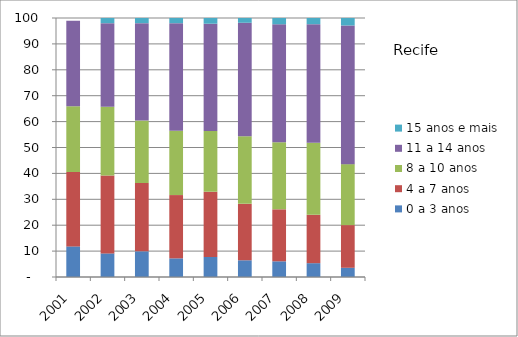
| Category | 0 a 3 anos | 4 a 7 anos | 8 a 10 anos | 11 a 14 anos | 15 anos e mais |
|---|---|---|---|---|---|
| 2001.0 | 11.82 | 28.71 | 25.37 | 32.99 | 0 |
| 2002.0 | 9.12 | 30.08 | 26.5 | 32.3 | 2 |
| 2003.0 | 9.9 | 26.4 | 24.11 | 37.6 | 1.99 |
| 2004.0 | 7.2 | 24.43 | 24.84 | 41.53 | 2 |
| 2005.0 | 7.72 | 25.21 | 23.46 | 41.4 | 2.21 |
| 2006.0 | 6.46 | 21.79 | 26.05 | 43.86 | 1.84 |
| 2007.0 | 6.06 | 20.07 | 25.93 | 45.52 | 2.42 |
| 2008.0 | 5.34 | 18.68 | 27.86 | 45.73 | 2.4 |
| 2009.0 | 3.56 | 16.48 | 23.54 | 53.53 | 2.9 |